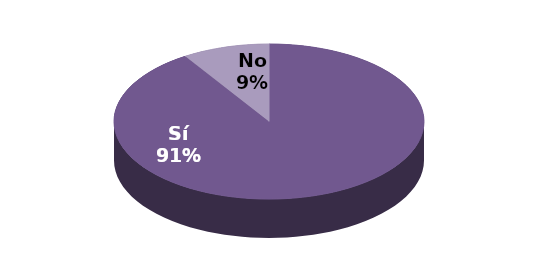
| Category | Series 1 |
|---|---|
| Sí | 10 |
| No | 1 |